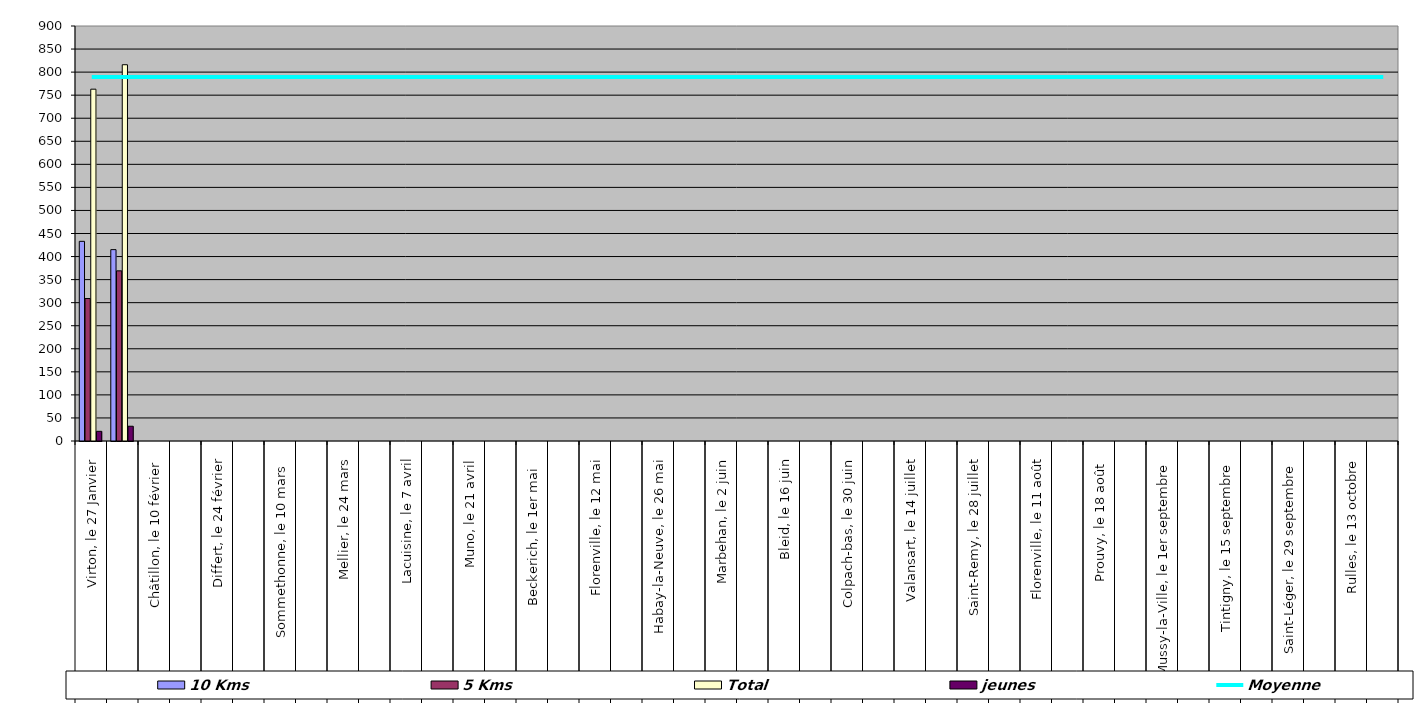
| Category | 10 Kms | 5 Kms | Total | jeunes |
|---|---|---|---|---|
| 0 | 433 | 309 | 763 | 21 |
| 1 | 415 | 369 | 816 | 32 |
| 2 | 0 | 0 | 0 | 0 |
| 3 | 0 | 0 | 0 | 0 |
| 4 | 0 | 0 | 0 | 0 |
| 5 | 0 | 0 | 0 | 0 |
| 6 | 0 | 0 | 0 | 0 |
| 7 | 0 | 0 | 0 | 0 |
| 8 | 0 | 0 | 0 | 0 |
| 9 | 0 | 0 | 0 | 0 |
| 10 | 0 | 0 | 0 | 0 |
| 11 | 0 | 0 | 0 | 0 |
| 12 | 0 | 0 | 0 | 0 |
| 13 | 0 | 0 | 0 | 0 |
| 14 | 0 | 0 | 0 | 0 |
| 15 | 0 | 0 | 0 | 0 |
| 16 | 0 | 0 | 0 | 0 |
| 17 | 0 | 0 | 0 | 0 |
| 18 | 0 | 0 | 0 | 0 |
| 19 | 0 | 0 | 0 | 0 |
| 20 | 0 | 0 | 0 | 0 |
| 21 | 0 | 0 | 0 | 0 |
| 22 | 0 | 0 | 0 | 0 |
| 23 | 0 | 0 | 0 | 0 |
| 24 | 0 | 0 | 0 | 0 |
| 25 | 0 | 0 | 0 | 0 |
| 26 | 0 | 0 | 0 | 0 |
| 27 | 0 | 0 | 0 | 0 |
| 28 | 0 | 0 | 0 | 0 |
| 29 | 0 | 0 | 0 | 0 |
| 30 | 0 | 0 | 0 | 0 |
| 31 | 0 | 0 | 0 | 0 |
| 32 | 0 | 0 | 0 | 0 |
| 33 | 0 | 0 | 0 | 0 |
| 34 | 0 | 0 | 0 | 0 |
| 35 | 0 | 0 | 0 | 0 |
| 36 | 0 | 0 | 0 | 0 |
| 37 | 0 | 0 | 0 | 0 |
| 38 | 0 | 0 | 0 | 0 |
| 39 | 0 | 0 | 0 | 0 |
| 40 | 0 | 0 | 0 | 0 |
| 41 | 0 | 0 | 0 | 0 |